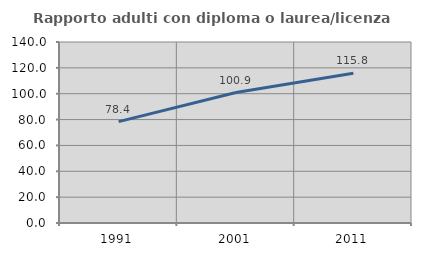
| Category | Rapporto adulti con diploma o laurea/licenza media  |
|---|---|
| 1991.0 | 78.378 |
| 2001.0 | 100.926 |
| 2011.0 | 115.789 |